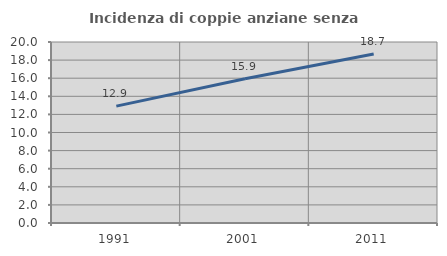
| Category | Incidenza di coppie anziane senza figli  |
|---|---|
| 1991.0 | 12.918 |
| 2001.0 | 15.947 |
| 2011.0 | 18.665 |